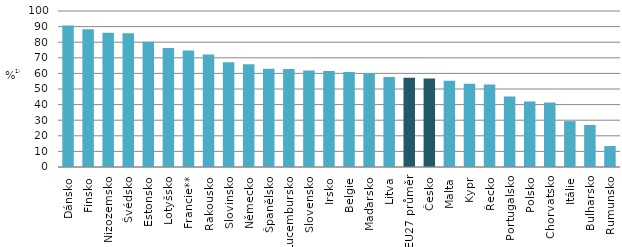
| Category | celkem |
|---|---|
| Dánsko | 90.691 |
| Finsko | 88.226 |
| Nizozemsko | 86.134 |
| Švédsko | 85.703 |
| Estonsko | 80.295 |
| Lotyšsko | 76.289 |
| Francie** | 74.724 |
| Rakousko | 72.037 |
| Slovinsko | 67.162 |
| Německo | 65.868 |
| Španělsko | 62.944 |
| Lucembursko | 62.898 |
| Slovensko | 61.835 |
| Irsko | 61.577 |
| Belgie | 60.902 |
| Maďarsko | 60.328 |
| Litva | 57.717 |
| EU27 průměr | 57.207 |
| Česko | 56.747 |
| Malta | 55.263 |
| Kypr | 53.337 |
| Řecko | 52.928 |
| Portugalsko | 45.2 |
| Polsko | 41.947 |
| Chorvatsko | 41.311 |
| Itálie | 29.378 |
| Bulharsko | 26.944 |
| Rumunsko | 13.432 |